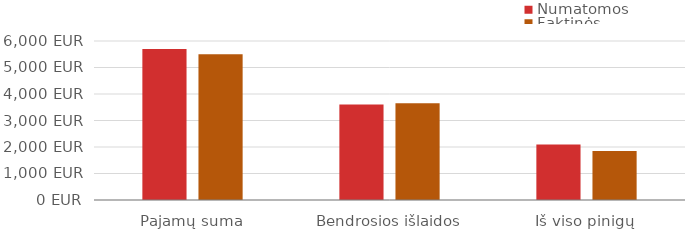
| Category | Numatomos | Faktinės |
|---|---|---|
| Pajamų suma | 5700 | 5500 |
| Bendrosios išlaidos | 3603 | 3655 |
| Iš viso pinigų | 2097 | 1845 |